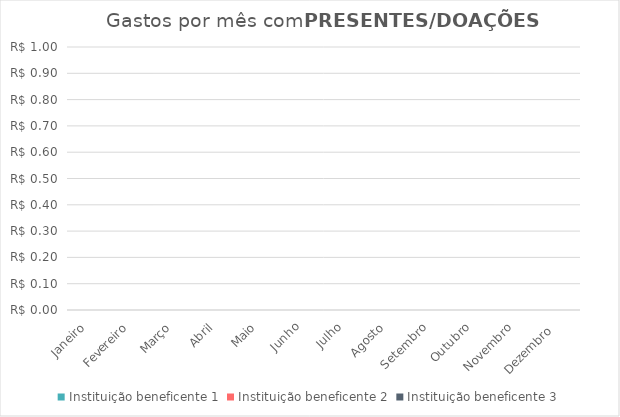
| Category | Instituição beneficente 1 | Instituição beneficente 2 | Instituição beneficente 3 |
|---|---|---|---|
| Janeiro | 0 | 0 | 0 |
| Fevereiro | 0 | 0 | 0 |
| Março | 0 | 0 | 0 |
| Abril | 0 | 0 | 0 |
| Maio | 0 | 0 | 0 |
| Junho | 0 | 0 | 0 |
| Julho | 0 | 0 | 0 |
| Agosto | 0 | 0 | 0 |
| Setembro | 0 | 0 | 0 |
| Outubro | 0 | 0 | 0 |
| Novembro | 0 | 0 | 0 |
| Dezembro  | 0 | 0 | 0 |